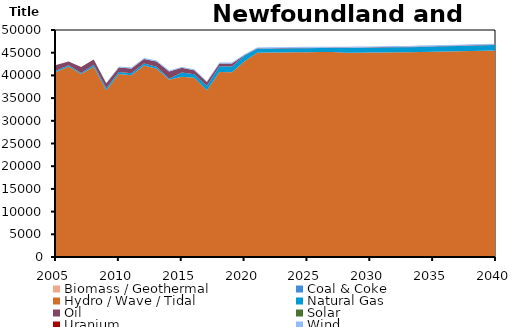
| Category | Biomass / Geothermal | Coal & Coke | Hydro / Wave / Tidal | Natural Gas | Oil | Solar | Uranium | Wind |
|---|---|---|---|---|---|---|---|---|
| 2005.0 | 0 | 0 | 40741.37 | 267.071 | 1306.213 | 0 | 0 | 0 |
| 2006.0 | 0 | 0 | 41953.37 | 277.824 | 823.061 | 0 | 0 | 0 |
| 2007.0 | 0 | 0 | 40291.38 | 236.767 | 1305.518 | 0 | 0 | 0 |
| 2008.0 | 0 | 0 | 41897.25 | 456.938 | 1139.063 | 0 | 0 | 0 |
| 2009.0 | 0 | 0 | 36728 | 447.622 | 1121.594 | 0 | 0 | 102 |
| 2010.0 | 0 | 0 | 40286.8 | 454.971 | 1017.228 | 0 | 0 | 183 |
| 2011.0 | 0 | 0 | 40033.37 | 449.291 | 1039.361 | 0 | 0 | 198 |
| 2012.0 | 0 | 0 | 42202.52 | 418.805 | 998.926 | 0 | 0 | 195 |
| 2013.0 | 0 | 0 | 41441.68 | 444.364 | 1179.715 | 0 | 0 | 192 |
| 2014.0 | 0 | 0 | 39047.83 | 239.4 | 1589.8 | 0 | 0 | 176.963 |
| 2015.0 | 0 | 0 | 39685.86 | 955.497 | 1025.604 | 0 | 0 | 172.392 |
| 2016.0 | 0 | 0 | 39482.84 | 750.43 | 924.37 | 0 | 0 | 189.997 |
| 2017.0 | 0 | 0 | 36738.97 | 953.422 | 839.478 | 0 | 0 | 186.418 |
| 2018.0 | 0 | 0 | 40723.2 | 1275.726 | 648.297 | 0 | 0 | 186.02 |
| 2019.0 | 0 | 0 | 40711.32 | 1273.104 | 643.584 | 0 | 0 | 186.019 |
| 2020.0 | 0 | 0 | 43141.63 | 1218.53 | 114.891 | 0 | 0 | 185.992 |
| 2021.0 | 0 | 0 | 44994.41 | 866.537 | 94.573 | 0 | 0 | 185.817 |
| 2022.0 | 0 | 0 | 45026.67 | 873.2 | 94.958 | 0 | 0 | 185.82 |
| 2023.0 | 0 | 0 | 45059.05 | 879.711 | 95.334 | 0 | 0 | 185.824 |
| 2024.0 | 0 | 0 | 45083.72 | 884.468 | 95.608 | 0 | 0 | 185.826 |
| 2025.0 | 0 | 0 | 45115.45 | 890.774 | 95.972 | 0 | 0 | 185.829 |
| 2026.0 | 0 | 0 | 45127.88 | 893.155 | 96.11 | 0 | 0 | 185.83 |
| 2027.0 | 0 | 0 | 45143.43 | 896.454 | 96.3 | 0 | 0 | 185.832 |
| 2028.0 | 0 | 0 | 44981.8 | 1071.749 | 94.441 | 0 | 0 | 185.816 |
| 2029.0 | 0 | 0 | 44999.18 | 1076.314 | 94.653 | 0 | 0 | 185.818 |
| 2030.0 | 0 | 0 | 45017.13 | 1080.975 | 94.87 | 0 | 0 | 185.82 |
| 2031.0 | 0 | 0 | 45046.13 | 1088.125 | 95.203 | 0 | 0 | 185.823 |
| 2032.0 | 0 | 0 | 45078.86 | 1096.135 | 95.576 | 0 | 0 | 185.826 |
| 2033.0 | 0 | 0 | 45115.8 | 1105.166 | 95.996 | 0 | 0 | 185.83 |
| 2034.0 | 0 | 0 | 45161.88 | 1116.574 | 96.528 | 0 | 0 | 185.834 |
| 2035.0 | 0 | 0 | 45210.54 | 1128.518 | 97.083 | 0 | 0 | 185.839 |
| 2036.0 | 0 | 0 | 45269.96 | 1143.248 | 97.769 | 0 | 0 | 185.845 |
| 2037.0 | 0 | 0 | 45321.77 | 1156.033 | 98.364 | 0 | 0 | 185.85 |
| 2038.0 | 0 | 0 | 45381.1 | 1170.792 | 102.511 | 0 | 0 | 185.856 |
| 2039.0 | 0 | 0 | 45437.46 | 1184.869 | 103.279 | 0 | 0 | 185.861 |
| 2040.0 | 0 | 0 | 45480.7 | 1195.772 | 107.762 | 0 | 0 | 185.866 |